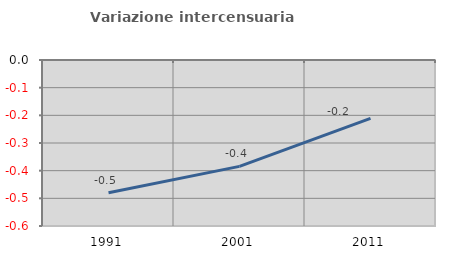
| Category | Variazione intercensuaria annua |
|---|---|
| 1991.0 | -0.48 |
| 2001.0 | -0.384 |
| 2011.0 | -0.211 |